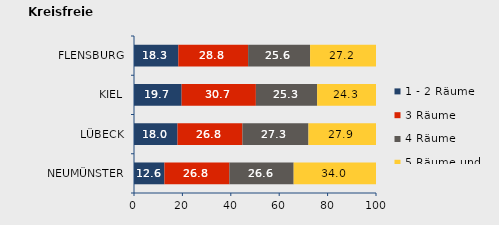
| Category | 1 - 2 Räume | 3 Räume | 4 Räume | 5 Räume und mehr |
|---|---|---|---|---|
| NEUMÜNSTER | 12.572 | 26.846 | 26.557 | 34.025 |
| LÜBECK | 17.984 | 26.829 | 27.277 | 27.91 |
| KIEL | 19.684 | 30.679 | 25.313 | 24.324 |
| FLENSBURG | 18.321 | 28.836 | 25.604 | 27.239 |